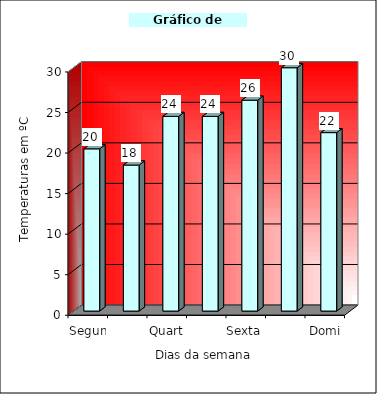
| Category | Temperatura em ºC |
|---|---|
| Segunda | 20 |
| Terça | 18 |
| Quarta | 24 |
| Quinta | 24 |
| Sexta | 26 |
| Sábado | 30 |
| Domingo | 22 |